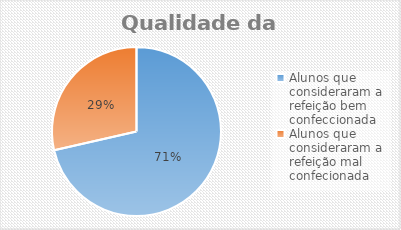
| Category | Series 5 |
|---|---|
| Alunos que consideraram a refeição bem confeccionada  | 60 |
| Alunos que consideraram a refeição mal confecionada  | 24 |